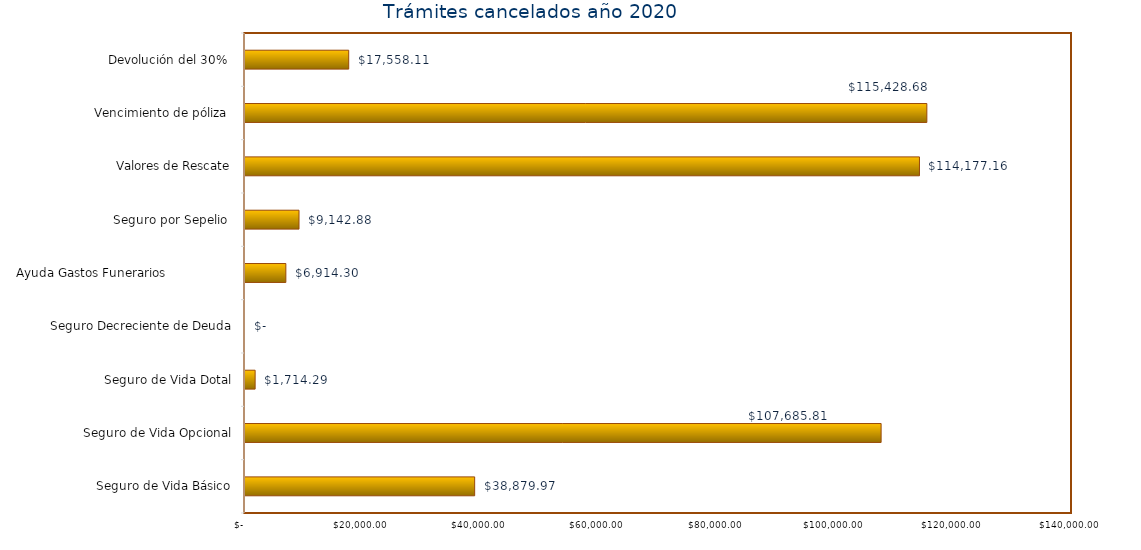
| Category | Monto  |
|---|---|
| Seguro de Vida Básico | 38879.97 |
| Seguro de Vida Opcional | 107685.81 |
| Seguro de Vida Dotal | 1714.29 |
| Seguro Decreciente de Deuda | 0 |
| Ayuda Gastos Funerarios                  | 6914.3 |
| Seguro por Sepelio  | 9142.88 |
| Valores de Rescate | 114177.16 |
| Vencimiento de póliza  | 115428.68 |
| Devolución del 30%  | 17558.11 |